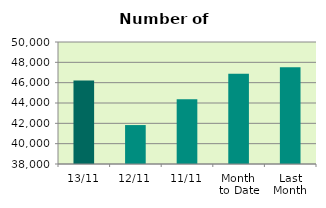
| Category | Series 0 |
|---|---|
| 13/11 | 46206 |
| 12/11 | 41830 |
| 11/11 | 44364 |
| Month 
to Date | 46880.444 |
| Last
Month | 47528 |